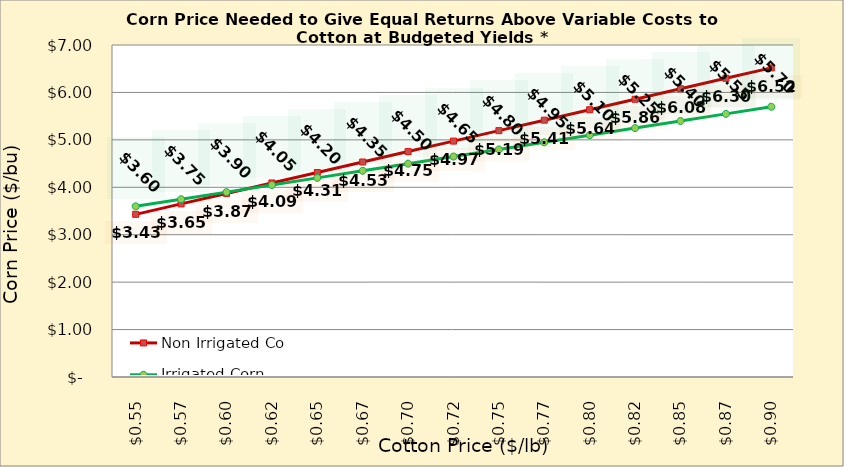
| Category | Non Irrigated Corn | Irrigated Corn |
|---|---|---|
| 0.5449999999999998 | 3.43 | 3.598 |
| 0.5699999999999998 | 3.65 | 3.748 |
| 0.5949999999999999 | 3.871 | 3.898 |
| 0.6199999999999999 | 4.091 | 4.048 |
| 0.6449999999999999 | 4.312 | 4.198 |
| 0.6699999999999999 | 4.533 | 4.348 |
| 0.695 | 4.753 | 4.498 |
| 0.72 | 4.974 | 4.648 |
| 0.745 | 5.194 | 4.798 |
| 0.77 | 5.415 | 4.948 |
| 0.795 | 5.635 | 5.098 |
| 0.8200000000000001 | 5.856 | 5.248 |
| 0.8450000000000001 | 6.077 | 5.398 |
| 0.8700000000000001 | 6.297 | 5.548 |
| 0.8950000000000001 | 6.518 | 5.698 |